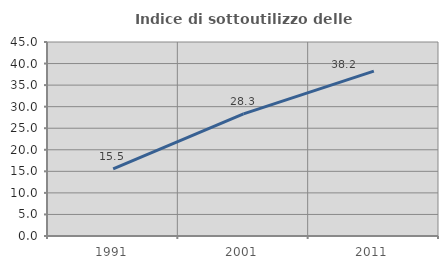
| Category | Indice di sottoutilizzo delle abitazioni  |
|---|---|
| 1991.0 | 15.548 |
| 2001.0 | 28.33 |
| 2011.0 | 38.246 |